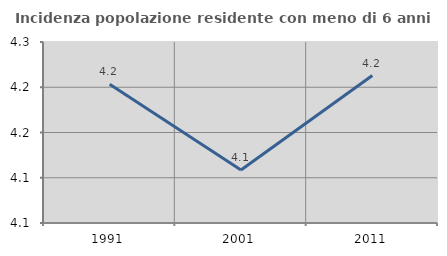
| Category | Incidenza popolazione residente con meno di 6 anni |
|---|---|
| 1991.0 | 4.203 |
| 2001.0 | 4.108 |
| 2011.0 | 4.213 |